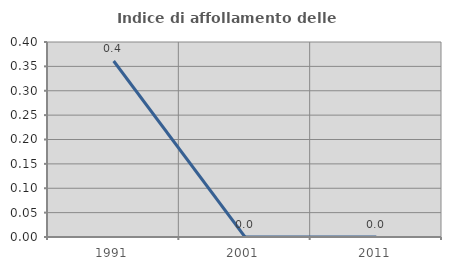
| Category | Indice di affollamento delle abitazioni  |
|---|---|
| 1991.0 | 0.361 |
| 2001.0 | 0 |
| 2011.0 | 0 |